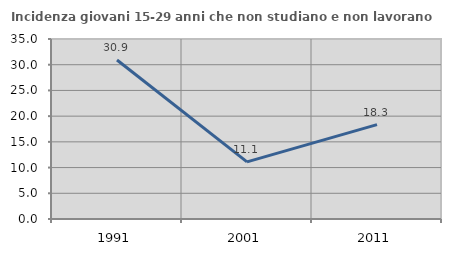
| Category | Incidenza giovani 15-29 anni che non studiano e non lavorano  |
|---|---|
| 1991.0 | 30.914 |
| 2001.0 | 11.106 |
| 2011.0 | 18.343 |